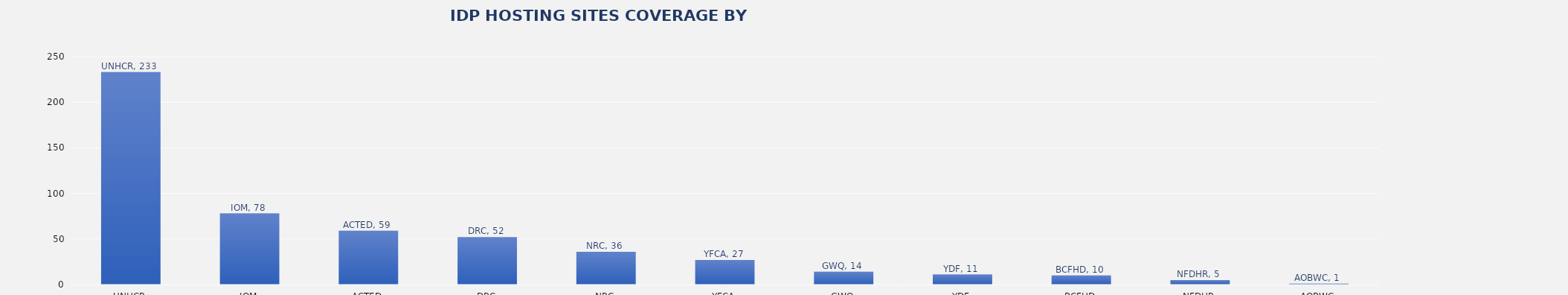
| Category | Total |
|---|---|
| UNHCR | 233 |
| IOM | 78 |
| ACTED | 59 |
| DRC | 52 |
| NRC | 36 |
| YFCA | 27 |
| GWQ | 14 |
| YDF | 11 |
| BCFHD | 10 |
| NFDHR | 5 |
| AOBWC | 1 |